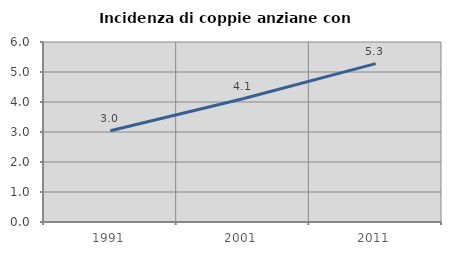
| Category | Incidenza di coppie anziane con figli |
|---|---|
| 1991.0 | 3.039 |
| 2001.0 | 4.11 |
| 2011.0 | 5.28 |